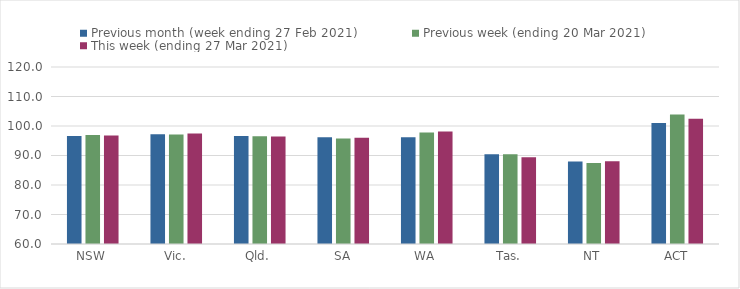
| Category | Previous month (week ending 27 Feb 2021) | Previous week (ending 20 Mar 2021) | This week (ending 27 Mar 2021) |
|---|---|---|---|
| NSW | 96.64 | 96.99 | 96.79 |
| Vic. | 97.2 | 97.16 | 97.43 |
| Qld. | 96.58 | 96.52 | 96.41 |
| SA | 96.17 | 95.8 | 95.99 |
| WA | 96.16 | 97.77 | 98.15 |
| Tas. | 90.44 | 90.44 | 89.43 |
| NT | 87.95 | 87.44 | 88.05 |
| ACT | 101.05 | 103.86 | 102.42 |